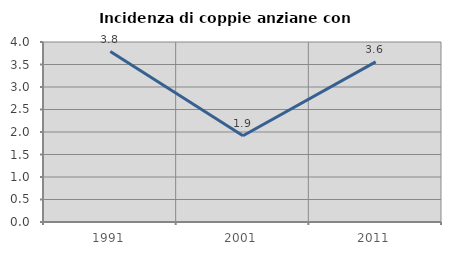
| Category | Incidenza di coppie anziane con figli |
|---|---|
| 1991.0 | 3.788 |
| 2001.0 | 1.916 |
| 2011.0 | 3.557 |